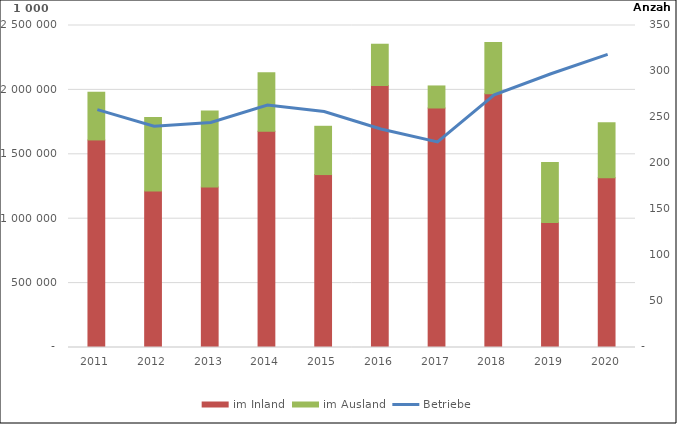
| Category | im Inland | im Ausland |
|---|---|---|
| 2011 | 1611545.985 | 370336.262 |
| 2012 | 1215603.362 | 569341.307 |
| 2013 | 1246830.08 | 589126.518 |
| 2014 | 1678439.11 | 455588.223 |
| 2015 | 1342701.236 | 374789.259 |
| 2016 | 2034299.972 | 320235.333 |
| 2017 | 1859552.818 | 171124.426 |
| 2018 | 1971074.968 | 396590.95 |
| 2019 | 971145.392 | 464737.795 |
| 2020 | 1318282.098 | 426147.164 |